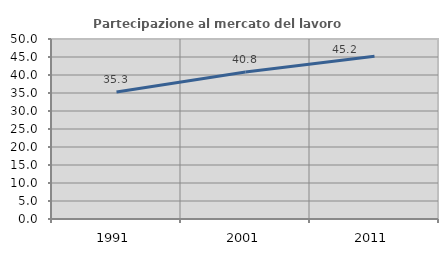
| Category | Partecipazione al mercato del lavoro  femminile |
|---|---|
| 1991.0 | 35.286 |
| 2001.0 | 40.835 |
| 2011.0 | 45.203 |